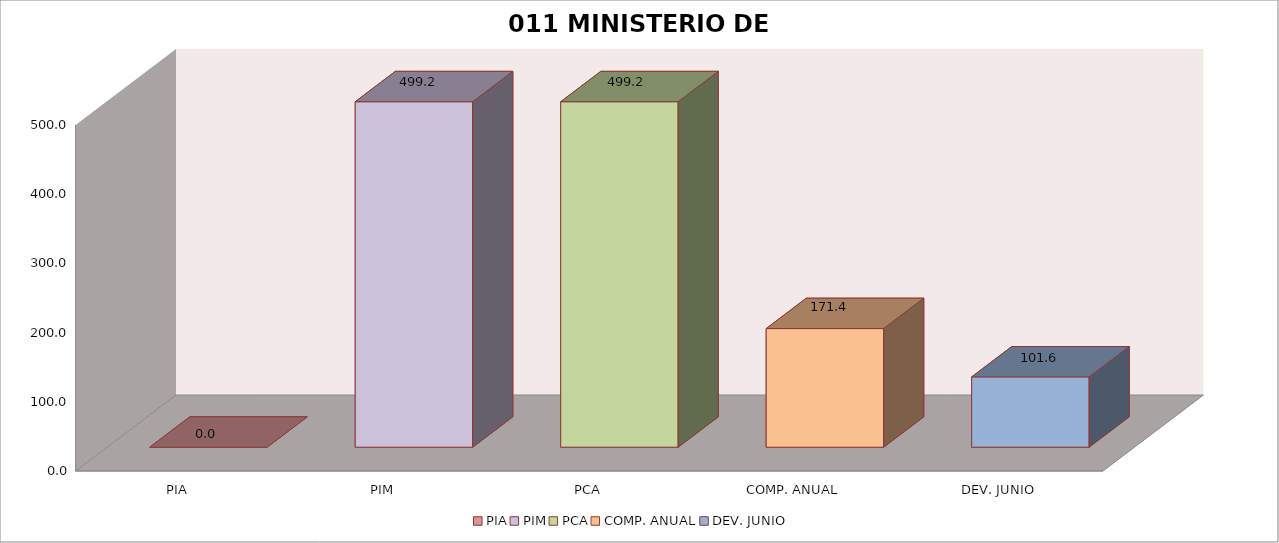
| Category | 011 MINISTERIO DE SALUD |
|---|---|
| PIA | 0 |
| PIM | 499.193 |
| PCA | 499.193 |
| COMP. ANUAL | 171.42 |
| DEV. JUNIO | 101.587 |